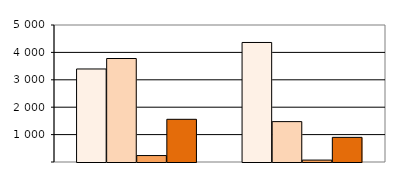
| Category | Series 0 | Series 1 | Series 2 | Series 3 |
|---|---|---|---|---|
| 0 | 3395 | 3777 | 235 | 1558 |
| 1 | 4362 | 1474 | 70 | 899 |